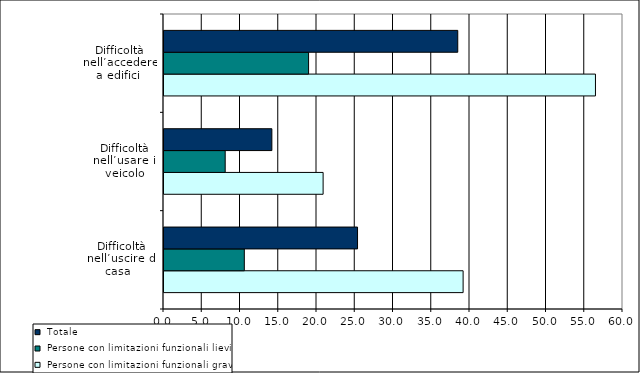
| Category |  Persone con limitazioni funzionali gravi |  Persone con limitazioni funzionali lievi |  Totale |
|---|---|---|---|
| Difficoltà nell’uscire di casa   | 39.1 | 10.5 | 25.3 |
| Difficoltà nell’usare il veicolo | 20.8 | 8 | 14.1 |
| Difficoltà nell’accedere a edifici  | 56.4 | 18.9 | 38.4 |